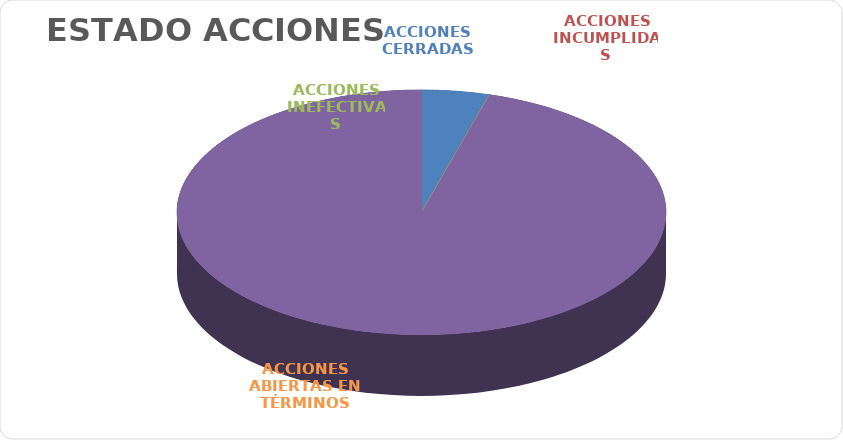
| Category | Series 0 |
|---|---|
| ACCIONES CERRADAS | 10 |
| ACCIONES INCUMPLIDAS | 0 |
| ACCIONES INEFECTIVAS | 0 |
| ACCIONES ABIERTAS EN TÉRMINOS | 213 |